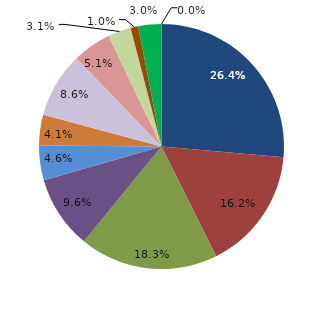
| Category | Series 0 |
|---|---|
| قبل الدخول | 26.396 |
| -1 | 16.244 |
| 1 | 18.274 |
| 2 | 9.645 |
| 3 | 4.569 |
| 4 | 4.061 |
|  5 - 9 | 8.629 |
|  10 - 14 | 5.076 |
|  15 - 19 | 3.046 |
|  20 - 24 | 1.015 |
| 25 + | 3.046 |
| غير مبين | 0 |